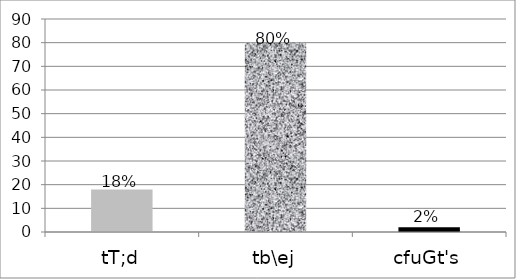
| Category | Series 0 |
|---|---|
| tT;d | 18 |
| tb\ej | 80 |
| cfuGt's | 2 |